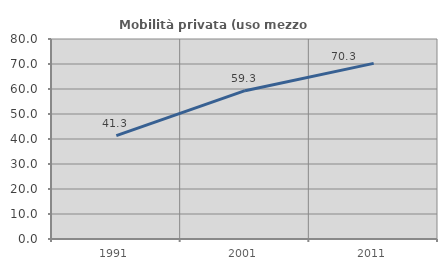
| Category | Mobilità privata (uso mezzo privato) |
|---|---|
| 1991.0 | 41.338 |
| 2001.0 | 59.323 |
| 2011.0 | 70.254 |